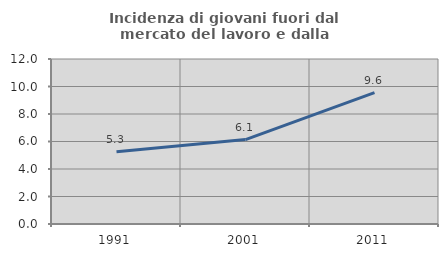
| Category | Incidenza di giovani fuori dal mercato del lavoro e dalla formazione  |
|---|---|
| 1991.0 | 5.262 |
| 2001.0 | 6.138 |
| 2011.0 | 9.555 |